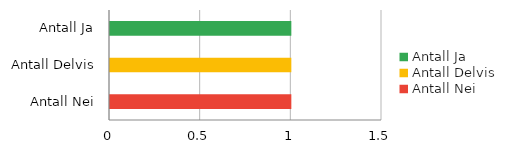
| Category | Series 0 |
|---|---|
| Antall Ja | 1 |
| Antall Delvis | 1 |
| Antall Nei | 1 |